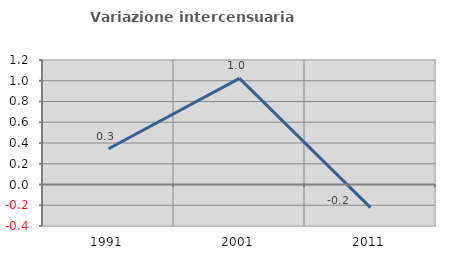
| Category | Variazione intercensuaria annua |
|---|---|
| 1991.0 | 0.345 |
| 2001.0 | 1.023 |
| 2011.0 | -0.223 |